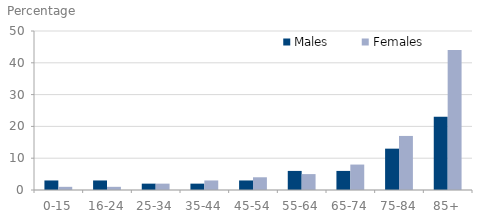
| Category | Males | Females |
|---|---|---|
| 0-15 | 3 | 1 |
| 16-24 | 3 | 1 |
| 25-34 | 2 | 2 |
| 35-44 | 2 | 3 |
| 45-54 | 3 | 4 |
| 55-64 | 6 | 5 |
| 65-74 | 6 | 8 |
| 75-84 | 13 | 17 |
| 85+ | 23 | 44 |